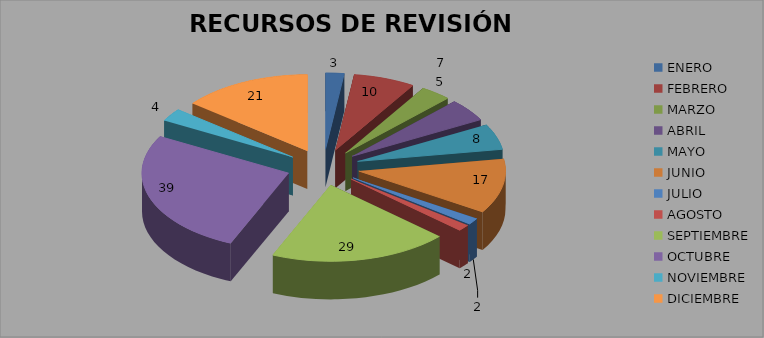
| Category | RECURSOS DE REVISIÓN |
|---|---|
| ENERO | 3 |
| FEBRERO | 10 |
| MARZO | 5 |
| ABRIL | 7 |
| MAYO | 8 |
| JUNIO | 17 |
| JULIO | 2 |
| AGOSTO | 2 |
| SEPTIEMBRE | 29 |
| OCTUBRE | 39 |
| NOVIEMBRE | 4 |
| DICIEMBRE | 21 |